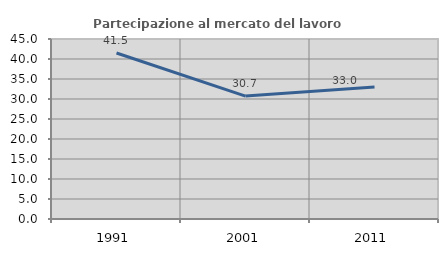
| Category | Partecipazione al mercato del lavoro  femminile |
|---|---|
| 1991.0 | 41.497 |
| 2001.0 | 30.72 |
| 2011.0 | 32.984 |